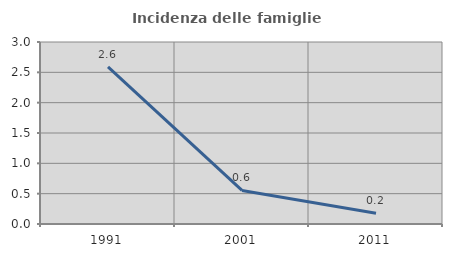
| Category | Incidenza delle famiglie numerose |
|---|---|
| 1991.0 | 2.59 |
| 2001.0 | 0.554 |
| 2011.0 | 0.176 |